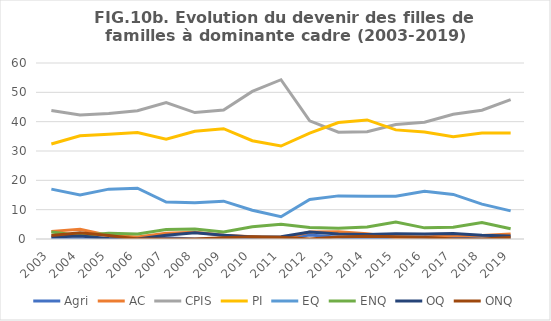
| Category | Agri | AC | CPIS | PI | EQ | ENQ | OQ | ONQ |
|---|---|---|---|---|---|---|---|---|
| 2003.0 | 0 | 2.6 | 43.8 | 32.4 | 17 | 2.4 | 0.7 | 1.2 |
| 2004.0 | 0 | 3.3 | 42.3 | 35.2 | 15 | 1.2 | 1 | 2.1 |
| 2005.0 | 0 | 1.2 | 42.8 | 35.7 | 17 | 2 | 0.2 | 1.2 |
| 2006.0 | 0.4 | 0.7 | 43.7 | 36.3 | 17.3 | 1.7 | 0 | 0 |
| 2007.0 | 0.4 | 2 | 46.5 | 34 | 12.6 | 3.2 | 1.3 | 0 |
| 2008.0 | 0 | 2.3 | 43.1 | 36.7 | 12.4 | 3.4 | 2.1 | 0 |
| 2009.0 | 0 | 1.3 | 44 | 37.6 | 12.9 | 2.4 | 1.3 | 0.4 |
| 2010.0 | 0 | 0.8 | 50.3 | 33.5 | 9.8 | 4.2 | 0.7 | 0.8 |
| 2011.0 | 0 | 0 | 54.3 | 31.7 | 7.6 | 5 | 0.8 | 0.6 |
| 2012.0 | 1.4 | 2.4 | 40.3 | 36.1 | 13.5 | 3.9 | 2.4 | 0 |
| 2013.0 | 0.6 | 2.5 | 36.4 | 39.7 | 14.7 | 3.7 | 1.7 | 0.7 |
| 2014.0 | 0 | 1.8 | 36.6 | 40.6 | 14.6 | 4.1 | 1.5 | 0.9 |
| 2015.0 | 0.3 | 0.5 | 39 | 37.2 | 14.6 | 5.8 | 1.8 | 0.8 |
| 2016.0 | 0.6 | 0.7 | 39.8 | 36.5 | 16.3 | 3.8 | 1.7 | 0.6 |
| 2017.0 | 0.3 | 1.2 | 42.5 | 34.9 | 15.2 | 4 | 1.9 | 0 |
| 2018.0 | 0 | 1.2 | 43.9 | 36.1 | 11.9 | 5.6 | 1.3 | 0 |
| 2019.0 | 0 | 1.7 | 47.5 | 36.1 | 9.6 | 3.5 | 1 | 0.5 |